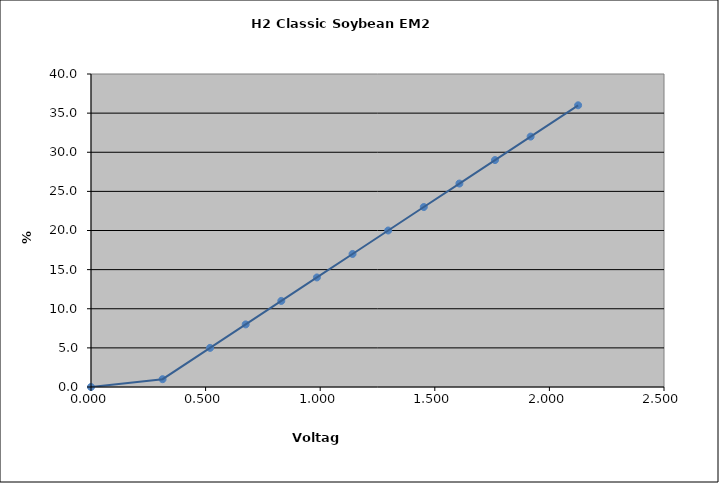
| Category | Generated Curve |
|---|---|
| 0.0 | 0 |
| 0.31232 | 1 |
| 0.51952 | 5 |
| 0.67492 | 8 |
| 0.8303200000000001 | 11 |
| 0.98572 | 14 |
| 1.1411200000000001 | 17 |
| 1.2965200000000001 | 20 |
| 1.45192 | 23 |
| 1.60732 | 26 |
| 1.76272 | 29 |
| 1.91812 | 32 |
| 2.1253200000000003 | 36 |